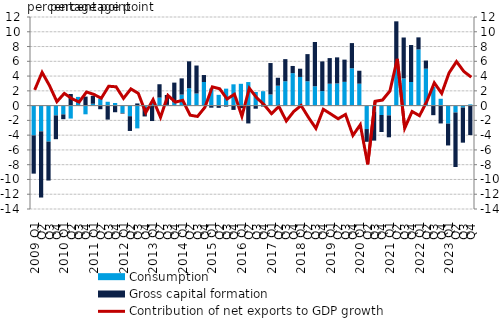
| Category | Consumption | Gross capital formation |
|---|---|---|
| 2009 Q1 | -4.032 | -5.18 |
| Q2 | -3.484 | -8.963 |
| Q3 | -4.871 | -5.275 |
| Q4 | -1.326 | -3.221 |
| 2010 Q1 | -1.191 | -0.647 |
| Q2 | -1.753 | 1.575 |
| Q3 | 1.179 | -0.011 |
| Q4 | -1.177 | 1.219 |
| 2011 Q1 | 0.252 | 1.073 |
| Q2 | 0.955 | -0.488 |
| Q3 | 0.522 | -1.893 |
| Q4 | 0.354 | -0.897 |
| 2012 Q1 | -0.992 | -0.085 |
| Q2 | -1.436 | -1.996 |
| Q3 | -3.081 | 0.294 |
| Q4 | -0.215 | -1.252 |
| 2013 Q1 | 0.412 | -2.088 |
| Q2 | 1.086 | 1.81 |
| Q3 | 0.103 | 1.333 |
| Q4 | 0.455 | 2.66 |
| 2014 Q1 | 1.489 | 2.202 |
| Q2 | 2.351 | 3.647 |
| Q3 | 1.636 | 3.793 |
| Q4 | 3.2 | 0.941 |
| 2015 Q1 | 2.32 | -0.28 |
| Q2 | 1.459 | -0.298 |
| Q3 | 2.298 | -0.134 |
| Q4 | 2.886 | -0.579 |
| 2016 Q1 | 2.955 | -0.349 |
| Q2 | 3.19 | -2.415 |
| Q3 | 1.848 | -0.419 |
| Q4 | 1.95 | -0.125 |
| 2017 Q1 | 1.51 | 4.256 |
| Q2 | 2.697 | 1.075 |
| Q3 | 3.3 | 2.996 |
| Q4 | 4.397 | 0.973 |
| 2018 Q1 | 3.881 | 1.117 |
| Q2 | 3.295 | 3.68 |
| Q3 | 2.62 | 5.992 |
| Q4 | 1.967 | 4.02 |
| 2019 Q1 | 2.965 | 3.47 |
| Q2 | 3 | 3.534 |
| Q3 | 3.22 | 3.008 |
| Q4 | 5.053 | 3.414 |
| 2020 Q1 | 2.971 | 1.751 |
| Q2 | -3.175 | -1.726 |
| Q3 | -0.822 | -3.919 |
| Q4 | -1.272 | -2.303 |
| 2021 Q1 | -1.322 | -2.968 |
| Q2 | 5.248 | 6.165 |
| Q3 | 3.683 | 5.54 |
| Q4 | 3.194 | 5.009 |
| 2022 Q1 | 7.61 | 1.632 |
| Q2 | 5.005 | 1.099 |
| Q3 | 2.525 | -1.295 |
| Q4 | 0.928 | -2.415 |
| 2023 Q1 | -2.434 | -2.962 |
| Q2 | -0.931 | -7.38 |
| Q3 | -0.255 | -4.762 |
| Q4 | 0.166 | -3.996 |